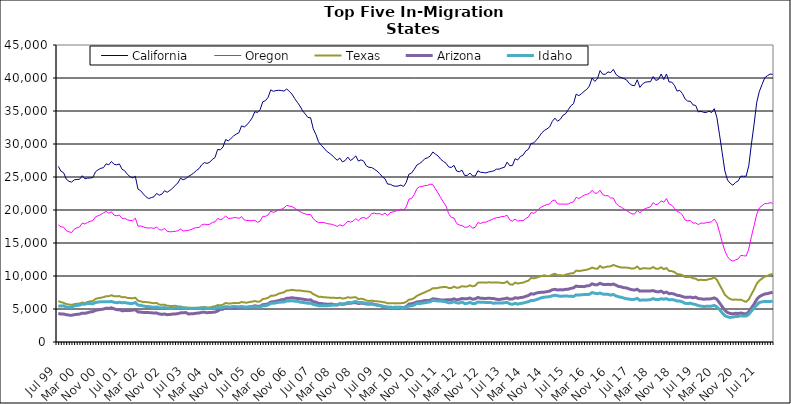
| Category | California | Oregon | Texas | Arizona | Idaho |
|---|---|---|---|---|---|
| Jul 99 | 26605 | 17749 | 6209 | 4339 | 5471 |
| Aug 99 | 25882 | 17447 | 6022 | 4228 | 5444 |
| Sep 99 | 25644 | 17401 | 5941 | 4237 | 5488 |
| Oct 99 | 24669 | 16875 | 5751 | 4134 | 5279 |
| Nov 99 | 24353 | 16701 | 5680 | 4073 | 5260 |
| Dec 99 | 24218 | 16570 | 5619 | 4042 | 5269 |
| Jan 00 | 24574 | 17109 | 5736 | 4142 | 5485 |
| Feb 00 | 24620 | 17295 | 5789 | 4192 | 5530 |
| Mar 00 | 24655 | 17436 | 5826 | 4226 | 5590 |
| Apr 00 | 25195 | 18009 | 5980 | 4375 | 5748 |
| May 00 | 24730 | 17875 | 5897 | 4337 | 5729 |
| Jun 00 | 24825 | 18113 | 6070 | 4444 | 5853 |
| Jul 00 | 24857 | 18294 | 6163 | 4555 | 5824 |
| Aug 00 | 24913 | 18376 | 6199 | 4603 | 5788 |
| Sep 00 | 25792 | 18971 | 6529 | 4804 | 5976 |
| Oct 00 | 26106 | 19135 | 6643 | 4870 | 6058 |
| Nov 00 | 26315 | 19306 | 6705 | 4926 | 6085 |
| Dec 00 | 26415 | 19570 | 6793 | 4991 | 6096 |
| Jan 01 | 26995 | 19781 | 6942 | 5122 | 6119 |
| Feb 01 | 26851 | 19519 | 6948 | 5089 | 6090 |
| Mar 01 | 27352 | 19720 | 7080 | 5180 | 6143 |
| Apr 01 | 26918 | 19221 | 6943 | 5020 | 6020 |
| May 01 | 26848 | 19126 | 6924 | 4899 | 5950 |
| Jun 01 | 26974 | 19241 | 6959 | 4895 | 6019 |
| Jul 01 | 26172 | 18725 | 6778 | 4737 | 5951 |
| Aug 01 | 25943 | 18736 | 6810 | 4757 | 5973 |
| Sep 01 | 25399 | 18514 | 6688 | 4753 | 5895 |
| Oct 01 | 25050 | 18415 | 6650 | 4780 | 5833 |
| Nov 01 | 24873 | 18381 | 6631 | 4826 | 5850 |
| Dec 01 | 25099 | 18765 | 6708 | 4898 | 5969 |
| Jan 02 | 23158 | 17561 | 6261 | 4560 | 5595 |
| Feb 02 | 22926 | 17573 | 6162 | 4531 | 5560 |
| Mar 02 | 22433 | 17452 | 6052 | 4481 | 5458 |
| Apr 02 | 22012 | 17314 | 6046 | 4458 | 5380 |
| May 02 | 21733 | 17267 | 6007 | 4452 | 5358 |
| Jun 02 | 21876 | 17298 | 5933 | 4444 | 5315 |
| Jul 02 | 21997 | 17209 | 5873 | 4383 | 5243 |
| Aug 02 | 22507 | 17436 | 5929 | 4407 | 5315 |
| Sep 02 | 22244 | 17010 | 5672 | 4248 | 5192 |
| Oct 02 | 22406 | 16952 | 5625 | 4191 | 5167 |
| Nov 02 | 22922 | 17223 | 5663 | 4242 | 5221 |
| Dec 02 | 22693 | 16770 | 5499 | 4142 | 5120 |
| Jan 03 | 22964 | 16694 | 5463 | 4166 | 5089 |
| Feb 03 | 23276 | 16727 | 5461 | 4226 | 5077 |
| Mar 03 | 23736 | 16766 | 5486 | 4251 | 5145 |
| Apr 03 | 24079 | 16859 | 5389 | 4289 | 5145 |
| May 03 | 24821 | 17117 | 5378 | 4415 | 5254 |
| Jun 03 | 24592 | 16812 | 5273 | 4426 | 5135 |
| Jul 03 | 24754 | 16875 | 5226 | 4466 | 5124 |
| Aug 03 | 25092 | 16922 | 5181 | 4244 | 5100 |
| Sep 03 | 25316 | 17036 | 5181 | 4279 | 5086 |
| Oct 03 | 25622 | 17228 | 5139 | 4301 | 5110 |
| Nov 03 | 25984 | 17335 | 5175 | 4362 | 5091 |
| Dec 03 | 26269 | 17350 | 5189 | 4396 | 5113 |
| Jan 04 | 26852 | 17734 | 5255 | 4492 | 5152 |
| Feb 04 | 27184 | 17860 | 5301 | 4502 | 5183 |
| Mar 04 | 27062 | 17757 | 5227 | 4443 | 5056 |
| Apr 04 | 27238 | 17840 | 5227 | 4461 | 5104 |
| May 04 | 27671 | 18113 | 5345 | 4493 | 5095 |
| Jun 04 | 27949 | 18201 | 5416 | 4532 | 5103 |
| Jul 04 | 29172 | 18727 | 5597 | 4697 | 5231 |
| Aug 04 | 29122 | 18529 | 5561 | 4945 | 5197 |
| Sep 04 | 29542 | 18678 | 5656 | 4976 | 5237 |
| Oct 04 | 30674 | 19108 | 5922 | 5188 | 5363 |
| Nov 04 | 30472 | 18716 | 5823 | 5106 | 5321 |
| Dec 04 | 30831 | 18755 | 5838 | 5135 | 5312 |
| Jan 05 | 31224 | 18823 | 5906 | 5155 | 5374 |
| Feb 05 | 31495 | 18842 | 5898 | 5168 | 5357 |
| Mar 05 | 31714 | 18738 | 5894 | 5212 | 5313 |
| Apr 05 | 32750 | 18998 | 6060 | 5340 | 5350 |
| May 05 | 32575 | 18504 | 5989 | 5269 | 5276 |
| Jun 05 | 32898 | 18414 | 5954 | 5252 | 5271 |
| Jul 05 | 33384 | 18395 | 6062 | 5322 | 5322 |
| Aug 05 | 33964 | 18381 | 6113 | 5375 | 5316 |
| Sep 05 | 34897 | 18426 | 6206 | 5493 | 5362 |
| Oct 05 | 34780 | 18132 | 6100 | 5408 | 5308 |
| Nov 05 | 35223 | 18332 | 6162 | 5434 | 5314 |
| Dec 05 | 36415 | 19047 | 6508 | 5658 | 5487 |
| Jan 06 | 36567 | 19032 | 6576 | 5688 | 5480 |
| Feb 06 | 37074 | 19257 | 6692 | 5792 | 5616 |
| Mar 06 | 38207 | 19845 | 6993 | 6052 | 5850 |
| Apr 06 | 37976 | 19637 | 7024 | 6101 | 5864 |
| May 06 | 38099 | 19781 | 7114 | 6178 | 5943 |
| Jun 06 | 38141 | 20061 | 7331 | 6276 | 6018 |
| Jul 06 | 38097 | 20111 | 7431 | 6399 | 6046 |
| Aug 06 | 38021 | 20333 | 7542 | 6450 | 6064 |
| Sep 06 | 38349 | 20686 | 7798 | 6627 | 6232 |
| Oct 06 | 37947 | 20591 | 7825 | 6647 | 6216 |
| Nov 06 | 37565 | 20526 | 7907 | 6707 | 6244 |
| Dec 06 | 36884 | 20272 | 7840 | 6648 | 6192 |
| Jan 07 | 36321 | 19984 | 7789 | 6597 | 6151 |
| Feb 07 | 35752 | 19752 | 7799 | 6554 | 6048 |
| Mar 07 | 35025 | 19547 | 7737 | 6487 | 5989 |
| Apr 07 | 34534 | 19412 | 7685 | 6430 | 5937 |
| May 07 | 34022 | 19296 | 7654 | 6353 | 5858 |
| Jun 07 | 33974 | 19318 | 7577 | 6390 | 5886 |
| Jul 07 | 32298 | 18677 | 7250 | 6117 | 5682 |
| Aug 07 | 31436 | 18322 | 7070 | 6034 | 5617 |
| Sep 07 | 30331 | 18087 | 6853 | 5847 | 5500 |
| Oct 07 | 29813 | 18108 | 6839 | 5821 | 5489 |
| Nov 07 | 29384 | 18105 | 6777 | 5769 | 5481 |
| Dec 07 | 28923 | 17949 | 6760 | 5733 | 5499 |
| Jan 08 | 28627 | 17890 | 6721 | 5732 | 5521 |
| Feb 08 | 28328 | 17834 | 6719 | 5749 | 5579 |
| Mar 08 | 27911 | 17680 | 6690 | 5650 | 5614 |
| Apr 08 | 27543 | 17512 | 6656 | 5612 | 5635 |
| May 08 | 27856 | 17754 | 6705 | 5774 | 5798 |
| Jun 08 | 27287 | 17589 | 6593 | 5717 | 5745 |
| Jul 08 | 27495 | 17834 | 6623 | 5761 | 5807 |
| Aug 08 | 28018 | 18309 | 6789 | 5867 | 5982 |
| Sep-08 | 27491 | 18164 | 6708 | 5864 | 5954 |
| Oct 08 | 27771 | 18291 | 6755 | 5942 | 6032 |
| Nov 08 | 28206 | 18706 | 6787 | 5970 | 6150 |
| Dec 08 | 27408 | 18353 | 6505 | 5832 | 5975 |
| Jan 09 | 27601 | 18778 | 6569 | 5890 | 5995 |
| Feb 09 | 27394 | 18863 | 6483 | 5845 | 5936 |
| Mar 09 | 26690 | 18694 | 6273 | 5751 | 5806 |
| Apr 09 | 26461 | 18943 | 6222 | 5735 | 5777 |
| May 09 | 26435 | 19470 | 6272 | 5819 | 5767 |
| Jun 09 | 26187 | 19522 | 6199 | 5700 | 5649 |
| Jul 09 | 25906 | 19408 | 6171 | 5603 | 5617 |
| Aug 09 | 25525 | 19469 | 6128 | 5533 | 5540 |
| Sep 09 | 25050 | 19249 | 6059 | 5405 | 5437 |
| Oct 09 | 24741 | 19529 | 6004 | 5349 | 5369 |
| Nov 09 | 23928 | 19187 | 5854 | 5271 | 5248 |
| Dec 09 | 23899 | 19607 | 5886 | 5261 | 5195 |
| Jan 10 | 23676 | 19703 | 5881 | 5232 | 5234 |
| Feb 10 | 23592 | 19845 | 5850 | 5272 | 5236 |
| Mar 10 | 23634 | 19946 | 5864 | 5278 | 5219 |
| Apr 10 | 23774 | 20134 | 5889 | 5257 | 5201 |
| May 10 | 23567 | 19966 | 5897 | 5172 | 5105 |
| Jun 10 | 24166 | 20464 | 6087 | 5356 | 5237 |
| Jul 10 | 25410 | 21627 | 6417 | 5742 | 5452 |
| Aug 10 | 25586 | 21744 | 6465 | 5797 | 5491 |
| Sep 10 | 26150 | 22314 | 6667 | 5907 | 5609 |
| Oct 10 | 26807 | 23219 | 6986 | 6070 | 5831 |
| Nov 10 | 27033 | 23520 | 7179 | 6100 | 5810 |
| Dec 10 | 27332 | 23551 | 7361 | 6182 | 5898 |
| Jan 11 | 27769 | 23697 | 7525 | 6276 | 5938 |
| Feb 11 | 27898 | 23718 | 7708 | 6267 | 6016 |
| Mar 11 | 28155 | 23921 | 7890 | 6330 | 6081 |
| Apr 11 | 28790 | 23847 | 8146 | 6544 | 6305 |
| May 11 | 28471 | 23215 | 8131 | 6502 | 6248 |
| Jun 11 | 28191 | 22580 | 8199 | 6445 | 6217 |
| Jul 11 | 27678 | 21867 | 8291 | 6368 | 6202 |
| Aug 11 | 27372 | 21203 | 8321 | 6356 | 6146 |
| Sep 11 | 27082 | 20570 | 8341 | 6387 | 6075 |
| Oct 11 | 26528 | 19442 | 8191 | 6402 | 5932 |
| Nov 11 | 26440 | 18872 | 8176 | 6426 | 5968 |
| Dec 11 | 26770 | 18784 | 8401 | 6533 | 6106 |
| Jan 12 | 25901 | 17963 | 8202 | 6390 | 5933 |
| Feb 12 | 25796 | 17718 | 8266 | 6456 | 5900 |
| Mar 12 | 26042 | 17647 | 8456 | 6600 | 6054 |
| Apr 12 | 25239 | 17386 | 8388 | 6534 | 5838 |
| May 12 | 25238 | 17407 | 8401 | 6558 | 5854 |
| Jun 12 | 25593 | 17673 | 8594 | 6669 | 6009 |
| Jul 12 | 25155 | 17237 | 8432 | 6474 | 5817 |
| Aug 12 | 25146 | 17391 | 8536 | 6539 | 5842 |
| Sep 12 | 25942 | 18102 | 8989 | 6759 | 6061 |
| Oct 12 | 25718 | 17953 | 9012 | 6618 | 6027 |
| Nov 12 | 25677 | 18134 | 9032 | 6611 | 6009 |
| Dec 12 | 25619 | 18166 | 8981 | 6601 | 5999 |
| Jan 13 | 25757 | 18344 | 9051 | 6627 | 5989 |
| Feb-13 | 25830 | 18512 | 9001 | 6606 | 5968 |
| Mar-13 | 25940 | 18689 | 9021 | 6577 | 5853 |
| Apr 13 | 26187 | 18844 | 9013 | 6478 | 5925 |
| May 13 | 26192 | 18884 | 9003 | 6431 | 5924 |
| Jun-13 | 26362 | 19013 | 8948 | 6508 | 5896 |
| Jul 13 | 26467 | 19037 | 8958 | 6559 | 5948 |
| Aug 13 | 27253 | 19198 | 9174 | 6655 | 6020 |
| Sep 13 | 26711 | 18501 | 8747 | 6489 | 5775 |
| Oct 13 | 26733 | 18301 | 8681 | 6511 | 5711 |
| Nov 13 | 27767 | 18620 | 8989 | 6709 | 5860 |
| Dec 13 | 27583 | 18320 | 8863 | 6637 | 5740 |
| Jan 14 | 28107 | 18409 | 8939 | 6735 | 5843 |
| Feb-14 | 28313 | 18383 | 8989 | 6779 | 5893 |
| Mar 14 | 28934 | 18696 | 9160 | 6918 | 6015 |
| Apr 14 | 29192 | 18946 | 9291 | 7036 | 6099 |
| May 14 | 30069 | 19603 | 9701 | 7314 | 6304 |
| Jun 14 | 30163 | 19487 | 9641 | 7252 | 6293 |
| Jul-14 | 30587 | 19754 | 9752 | 7415 | 6427 |
| Aug-14 | 31074 | 20201 | 9882 | 7499 | 6557 |
| Sep 14 | 31656 | 20459 | 9997 | 7536 | 6719 |
| Oct 14 | 32037 | 20663 | 10109 | 7555 | 6786 |
| Nov 14 | 32278 | 20825 | 9992 | 7628 | 6831 |
| Dec 14 | 32578 | 20918 | 10006 | 7705 | 6860 |
| Jan 15 | 33414 | 21396 | 10213 | 7906 | 7000 |
| Feb 15 | 33922 | 21518 | 10337 | 7982 | 7083 |
| Mar 15 | 33447 | 20942 | 10122 | 7891 | 7006 |
| Apr-15 | 33731 | 20893 | 10138 | 7906 | 6931 |
| May 15 | 34343 | 20902 | 10053 | 7895 | 6952 |
| Jun-15 | 34572 | 20870 | 10192 | 7973 | 6966 |
| Jul 15 | 35185 | 20916 | 10303 | 8000 | 6949 |
| Aug 15 | 35780 | 21115 | 10399 | 8126 | 6938 |
| Sep 15 | 36109 | 21246 | 10428 | 8207 | 6896 |
| Oct 15 | 37555 | 21908 | 10813 | 8477 | 7140 |
| Nov 15 | 37319 | 21750 | 10763 | 8390 | 7112 |
| Dec 15 | 37624 | 21990 | 10807 | 8395 | 7149 |
| Jan 16 | 37978 | 22248 | 10892 | 8388 | 7201 |
| Feb 16 | 38285 | 22369 | 10951 | 8508 | 7192 |
| Mar 16 | 38792 | 22506 | 11075 | 8547 | 7226 |
| Apr 16 | 39994 | 22999 | 11286 | 8815 | 7487 |
| May 16 | 39488 | 22548 | 11132 | 8673 | 7382 |
| Jun 16 | 39864 | 22556 | 11100 | 8682 | 7315 |
| Jul 16 | 41123 | 22989 | 11516 | 8903 | 7420 |
| Aug 16 | 40573 | 22333 | 11251 | 8731 | 7261 |
| Sep 16 | 40560 | 22162 | 11340 | 8692 | 7216 |
| Oct 16 | 40923 | 22172 | 11456 | 8742 | 7233 |
| Nov 16 | 40817 | 21818 | 11459 | 8685 | 7101 |
| Dec 16 | 41311 | 21815 | 11681 | 8783 | 7203 |
| Jan 17 | 40543 | 21029 | 11524 | 8609 | 6982 |
| Feb 17 | 40218 | 20613 | 11385 | 8416 | 6852 |
| Mar 17 | 40052 | 20425 | 11276 | 8354 | 6775 |
| Apr 17 | 39913 | 20147 | 11297 | 8218 | 6653 |
| May 17 | 39695 | 19910 | 11265 | 8196 | 6552 |
| Jun 17 | 39177 | 19650 | 11225 | 8034 | 6500 |
| Jul 17 | 38901 | 19419 | 11115 | 7923 | 6429 |
| Aug 17 | 38827 | 19389 | 11168 | 7867 | 6479 |
| Sep 17 | 39736 | 19936 | 11426 | 7991 | 6609 |
| Oct 17 | 38576 | 19547 | 11041 | 7708 | 6315 |
| Nov 17 | 39108 | 20013 | 11158 | 7746 | 6381 |
| Dec 17 | 39359 | 20202 | 11185 | 7743 | 6366 |
| Jan 18 | 39420 | 20362 | 11118 | 7736 | 6380 |
| Feb 18 | 39440 | 20476 | 11128 | 7741 | 6407 |
| Mar 18 | 40218 | 21106 | 11362 | 7789 | 6578 |
| Apr 18 | 39637 | 20788 | 11111 | 7642 | 6423 |
| May 18 | 39777 | 20933 | 11097 | 7591 | 6430 |
| Jun 18 | 40602 | 21381 | 11317 | 7721 | 6554 |
| Jul 18 | 39767 | 21189 | 11038 | 7445 | 6489 |
| Aug 18 | 40608 | 21729 | 11200 | 7560 | 6569 |
| Sep 18 | 39395 | 20916 | 10772 | 7318 | 6383 |
| Oct 18 | 39383 | 20724 | 10740 | 7344 | 6429 |
| Nov 18 | 38891 | 20265 | 10605 | 7255 | 6365 |
| Dec 18 | 38013 | 19741 | 10292 | 7069 | 6205 |
| Jan 19 | 38130 | 19643 | 10261 | 7032 | 6203 |
| Feb 19 | 37658 | 19237 | 10132 | 6892 | 6073 |
| Mar 19 | 36831 | 18492 | 9848 | 6766 | 5863 |
| Apr 19 | 36492 | 18349 | 9839 | 6763 | 5827 |
| May 19 | 36481 | 18407 | 9867 | 6809 | 5873 |
| Jun 19 | 35925 | 17998 | 9661 | 6698 | 5761 |
| Jul 19 | 35843 | 18049 | 9598 | 6800 | 5673 |
| Aug 19 | 34870 | 17785 | 9361 | 6577 | 5512 |
| Sep 19 | 34945 | 18038 | 9428 | 6547 | 5437 |
| Oct 19 | 34802 | 17977 | 9385 | 6483 | 5390 |
| Nov 19 | 34775 | 18072 | 9403 | 6511 | 5401 |
| Dec 19 | 34976 | 18140 | 9518 | 6521 | 5419 |
| Jan 20 | 34774 | 18209 | 9594 | 6561 | 5434 |
| Feb 20 | 35352 | 18632 | 9804 | 6682 | 5543 |
| Mar 20 | 34013 | 18041 | 9411 | 6464 | 5330 |
| Apr 20 | 31385 | 16629 | 8666 | 5922 | 4906 |
| May 20 | 28657 | 15123 | 7927 | 5355 | 4419 |
| Jun 20 | 25915 | 13817 | 7164 | 4815 | 3992 |
| Jul 20 | 24545 | 12926 | 6776 | 4457 | 3810 |
| Aug 20 | 24048 | 12443 | 6521 | 4326 | 3720 |
| Sep 20 | 23756 | 12258 | 6386 | 4266 | 3784 |
| Oct 20 | 24166 | 12429 | 6452 | 4347 | 3861 |
| Nov 20 | 24404 | 12597 | 6386 | 4324 | 3883 |
| Dec 20 | 25120 | 13122 | 6420 | 4394 | 3974 |
| Jan 21 | 25111 | 13080 | 6236 | 4304 | 3924 |
| Feb 21 | 25114 | 13015 | 6094 | 4260 | 3930 |
| Mar 21 | 26701 | 14096 | 6455 | 4567 | 4185 |
| Apr 21 | 29998 | 15978 | 7222 | 5164 | 4697 |
| May 21 | 33020 | 17641 | 7969 | 5748 | 5148 |
| Jun 21 | 36320 | 19369 | 8840 | 6450 | 5628 |
| Jul 21 | 37989 | 20320 | 9306 | 6877 | 5984 |
| Aug 21 | 39007 | 20657 | 9615 | 7094 | 6084 |
| Sep 21 | 40023 | 20974 | 9914 | 7277 | 6151 |
| Oct 21 | 40348 | 20966 | 10003 | 7327 | 6140 |
| Nov 21 | 40599 | 21096 | 10203 | 7437 | 6136 |
| Dec 21 | 40548 | 21032 | 10328 | 7532 | 6183 |